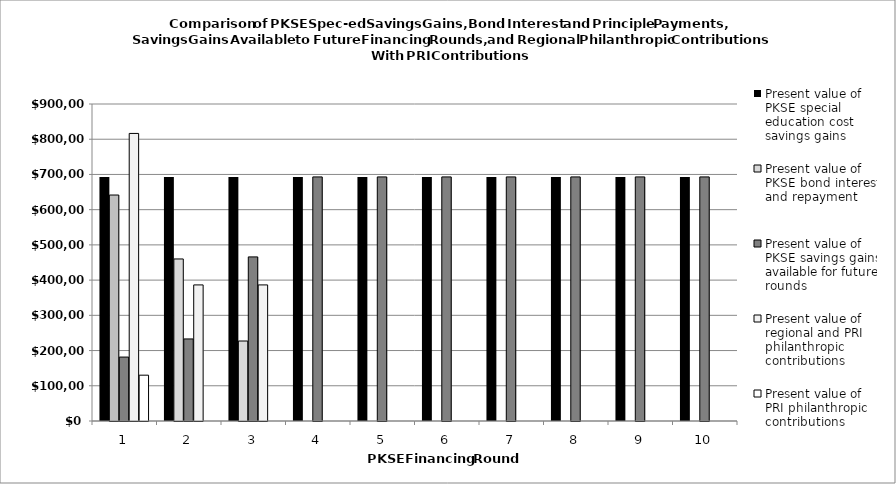
| Category | Present value of PKSE special education cost savings gains | Present value of PKSE bond interest and repayment | Present value of PKSE savings gains available for future rounds | Present value of regional and PRI philanthropic contributions | Present value of PRI philanthropic contributions |
|---|---|---|---|---|---|
| 0 | 693009.351 | 641581.21 | 181515.814 | 816446.634 | 130087.673 |
| 1 | 693009.351 | 460065.396 | 232943.955 | 386358.961 | 0 |
| 2 | 693009.351 | 227121.442 | 465887.91 | 386358.961 | 0 |
| 3 | 693009.351 | 0 | 693009.351 | 0 | 0 |
| 4 | 693009.351 | 0 | 693009.351 | 0 | 0 |
| 5 | 693009.351 | 0 | 693009.351 | 0 | 0 |
| 6 | 693009.351 | 0 | 693009.351 | 0 | 0 |
| 7 | 693009.351 | 0 | 693009.351 | 0 | 0 |
| 8 | 693009.351 | 0 | 693009.351 | 0 | 0 |
| 9 | 693009.351 | 0 | 693009.351 | 0 | 0 |